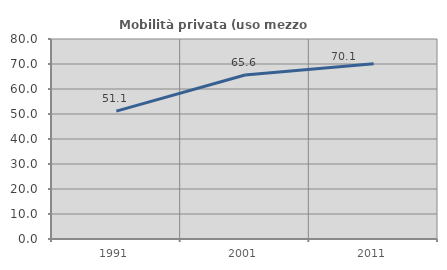
| Category | Mobilità privata (uso mezzo privato) |
|---|---|
| 1991.0 | 51.131 |
| 2001.0 | 65.625 |
| 2011.0 | 70.085 |